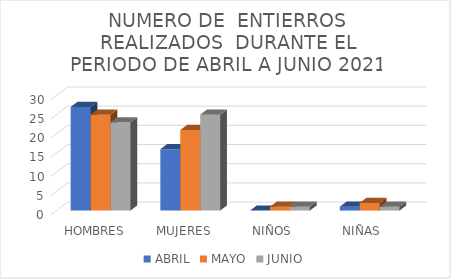
| Category | ABRIL | MAYO | JUNIO |
|---|---|---|---|
| HOMBRES | 27 | 25 | 23 |
| MUJERES | 16 | 21 | 25 |
| NIÑOS  | 0 | 1 | 1 |
| NIÑAS  | 1 | 2 | 1 |